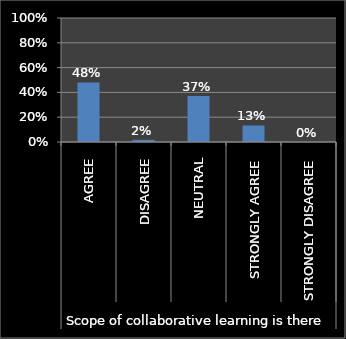
| Category | Series 0 |
|---|---|
| 0 | 0.48 |
| 1 | 0.017 |
| 2 | 0.37 |
| 3 | 0.133 |
| 4 | 0 |